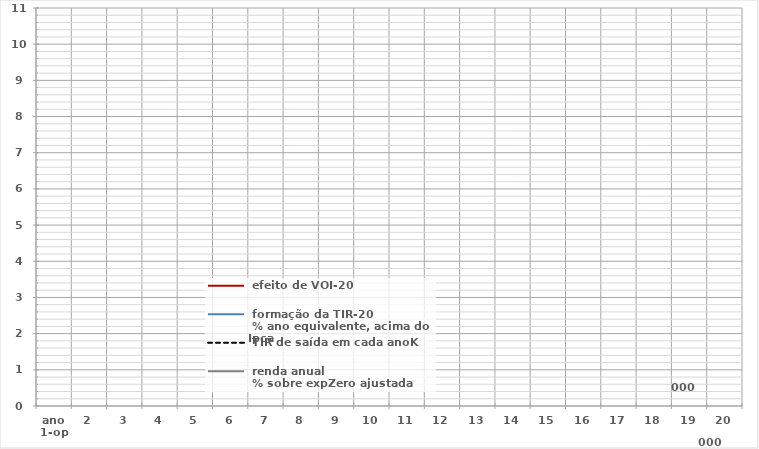
| Category |  efeito de VOI-20 |  formação da TIR-20
 % ano equivalente, acima do Ipca |  TIR de saída em cada anoK |  renda anual
 % sobre expZero ajustada |
|---|---|---|---|---|
| ano
1-op | 0 | 0 | 0 |  |
| 2 | 0 | 0 | 0 |  |
| 3 | 0 | 0 | 0 |  |
| 4 | 0 | 0 | 0 |  |
| 5 | 0 | 0 | 0 |  |
| 6 | 0 | 0 | 0 |  |
| 7 | 0 | 0 | 0 |  |
| 8 | 0 | 0 | 0 |  |
| 9 | 0 | 0 | 0 |  |
| 10 | 0 | 0 | 0 |  |
| 11 | 0 | 0 | 0 |  |
| 12 | 0 | 0 | 0 |  |
| 13 | 0 | 0 | 0 |  |
| 14 | 0 | 0 | 0 |  |
| 15 | 0 | 0 | 0 |  |
| 16 | 0 | 0 | 0 |  |
| 17 | 0 | 0 | 0 |  |
| 18 | 0 | 0 | 0 |  |
| 19 | 0 | 0 | 0 |  |
| 20 | 0 | 0 | 0 |  |